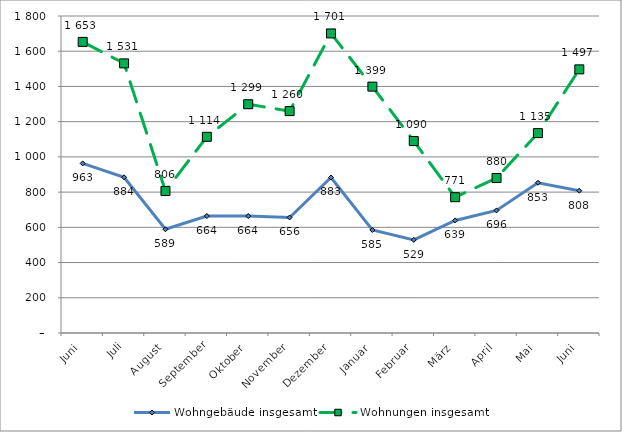
| Category | Wohngebäude insgesamt | Wohnungen insgesamt |
|---|---|---|
| Juni | 963 | 1653 |
| Juli | 884 | 1531 |
| August | 589 | 806 |
| September | 664 | 1114 |
| Oktober | 664 | 1299 |
| November | 656 | 1260 |
| Dezember | 883 | 1701 |
| Januar | 585 | 1399 |
| Februar | 529 | 1090 |
| März | 639 | 771 |
| April | 696 | 880 |
| Mai | 853 | 1135 |
| Juni | 808 | 1497 |